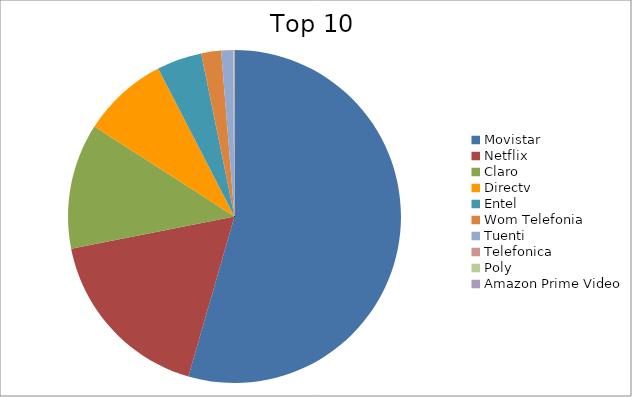
| Category | Series 0 |
|---|---|
| Movistar | 54.47 |
| Netflix | 17.43 |
| Claro | 12.18 |
| Directv | 8.34 |
| Entel | 4.37 |
| Wom Telefonia | 1.93 |
| Tuenti | 1.14 |
| Telefonica | 0.06 |
| Poly | 0.06 |
| Amazon Prime Video | 0.02 |